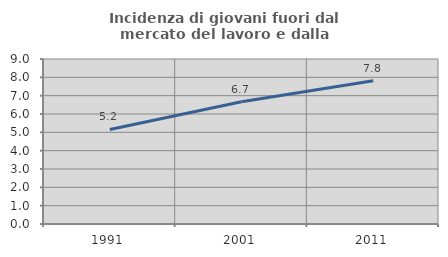
| Category | Incidenza di giovani fuori dal mercato del lavoro e dalla formazione  |
|---|---|
| 1991.0 | 5.155 |
| 2001.0 | 6.667 |
| 2011.0 | 7.812 |